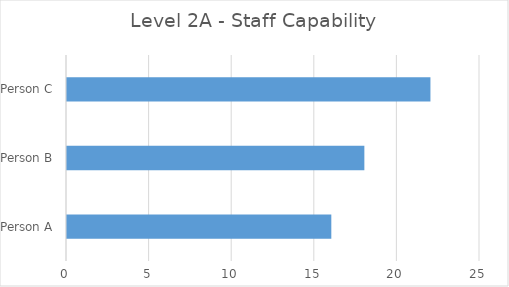
| Category | Series 0 |
|---|---|
| Person A | 16 |
| Person B | 18 |
| Person C | 22 |